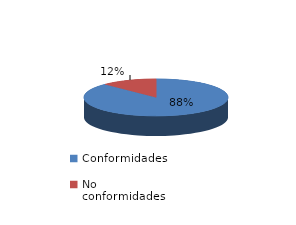
| Category | Series 0 |
|---|---|
| Conformidades | 1318 |
| No conformidades | 188 |